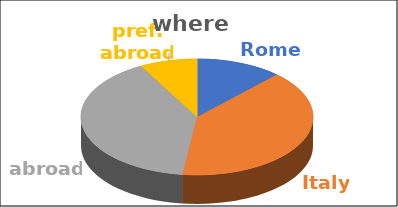
| Category | where | Series 1 | Series 2 | Series 3 | Series 4 |
|---|---|---|---|---|---|
| Rome | 0.12 |  |  |  |  |
| Italy | 0.4 |  |  |  |  |
| abroad | 0.4 |  |  |  |  |
| pref. abroad | 0.08 |  |  |  |  |